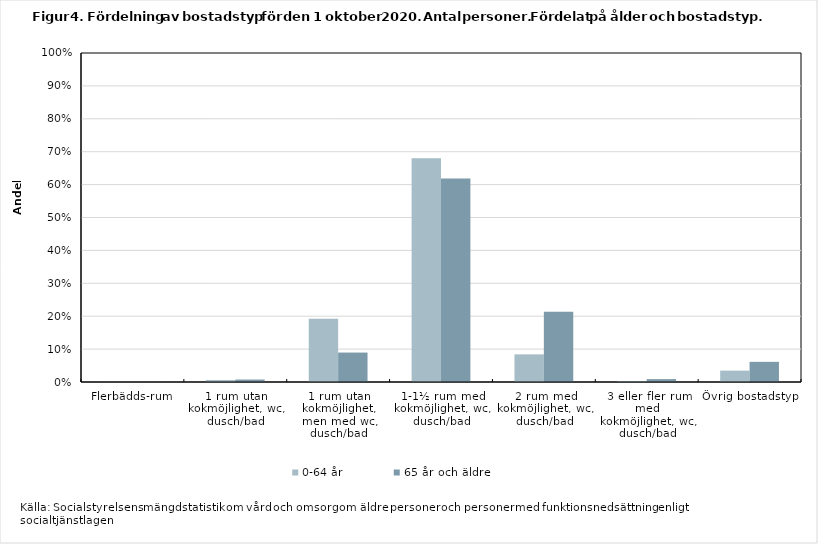
| Category | 0-64 år | 65 år och äldre |
|---|---|---|
| Flerbädds-rum | 0 | 0.001 |
| 1 rum utan kokmöjlighet, wc, dusch/bad | 0.006 | 0.008 |
| 1 rum utan kokmöjlighet, men med wc, dusch/bad | 0.192 | 0.089 |
| 1-1½ rum med kokmöjlighet, wc, dusch/bad | 0.68 | 0.619 |
| 2 rum med kokmöjlighet, wc, dusch/bad | 0.084 | 0.214 |
| 3 eller fler rum med kokmöjlighet, wc, dusch/bad | 0.003 | 0.009 |
| Övrig bostadstyp | 0.035 | 0.061 |